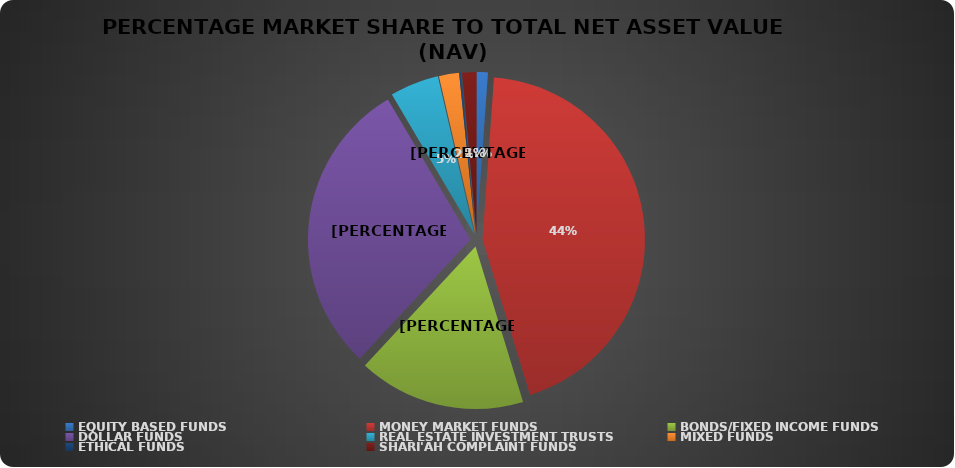
| Category | NET ASSET VALUE |
|---|---|
| EQUITY BASED FUNDS | 21667567762.56 |
| MONEY MARKET FUNDS | 847949243662.16 |
| BONDS/FIXED INCOME FUNDS | 319728597414.121 |
| DOLLAR FUNDS | 568541591372.955 |
| REAL ESTATE INVESTMENT TRUSTS | 93543514118.8 |
| MIXED FUNDS | 38533905044.201 |
| ETHICAL FUNDS | 3844664135.71 |
| SHARI'AH COMPLAINT FUNDS | 27114196022.17 |